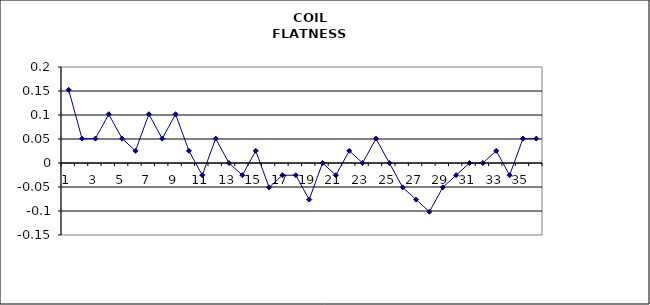
| Category | Series 0 |
|---|---|
| 0 | 0.152 |
| 1 | 0.051 |
| 2 | 0.051 |
| 3 | 0.102 |
| 4 | 0.051 |
| 5 | 0.025 |
| 6 | 0.102 |
| 7 | 0.051 |
| 8 | 0.102 |
| 9 | 0.025 |
| 10 | -0.025 |
| 11 | 0.051 |
| 12 | 0 |
| 13 | -0.025 |
| 14 | 0.025 |
| 15 | -0.051 |
| 16 | -0.025 |
| 17 | -0.025 |
| 18 | -0.076 |
| 19 | 0 |
| 20 | -0.025 |
| 21 | 0.025 |
| 22 | 0 |
| 23 | 0.051 |
| 24 | 0 |
| 25 | -0.051 |
| 26 | -0.076 |
| 27 | -0.102 |
| 28 | -0.051 |
| 29 | -0.025 |
| 30 | 0 |
| 31 | 0 |
| 32 | 0.025 |
| 33 | -0.025 |
| 34 | 0.051 |
| 35 | 0.051 |